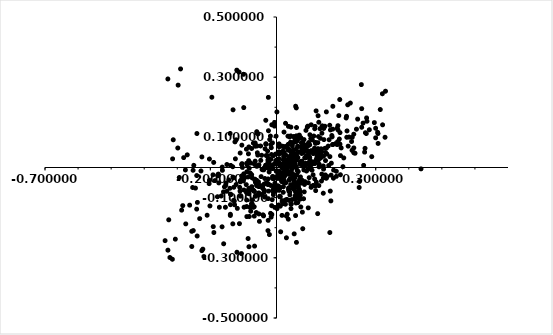
| Category | Log10 (GFP) |
|---|---|
| -0.1323 | 0.002 |
| 0.0478 | 0.018 |
| 0.1305 | 0.048 |
| 0.1004 | 0.034 |
| 0.3296 | 0.253 |
| 0.0146 | -0.022 |
| -0.0314 | 0.007 |
| 0.0942 | 0.07 |
| 0.2576 | 0.196 |
| -0.07 | 0.081 |
| 0.1342 | 0.047 |
| 0.1695 | 0.076 |
| 0.1578 | 0.006 |
| 0.1704 | 0.203 |
| 0.165 | -0.025 |
| 0.1859 | 0.125 |
| 0.1074 | -0.009 |
| 0.1563 | 0.071 |
| 0.1116 | -0.059 |
| 0.1091 | 0.015 |
| 0.1701 | 0.128 |
| 0.1482 | 0.023 |
| 0.2736 | 0.154 |
| 0.133 | 0.032 |
| 0.1658 | 0.014 |
| 0.229 | 0.1 |
| 0.1834 | 0.131 |
| 0.2677 | 0.064 |
| 0.0689 | -0.072 |
| 0.1084 | 0.092 |
| 0.0375 | -0.079 |
| -0.0334 | 0.002 |
| 0.0966 | -0.005 |
| 0.1848 | 0.086 |
| 0.1107 | -0.024 |
| 0.1309 | 0.044 |
| 0.1478 | -0.025 |
| -0.2974 | 0.274 |
| 0.2125 | 0.1 |
| -0.0111 | -0.004 |
| 0.192 | 0.116 |
| 0.1857 | 0.139 |
| 0.1681 | 0.102 |
| -0.0644 | 0.021 |
| 0.03 | -0.234 |
| -0.2561 | -0.262 |
| -0.0833 | -0.263 |
| 0.0458 | 0.01 |
| 0.0604 | -0.249 |
| -0.2257 | -0.276 |
| 0.0038 | -0.025 |
| 0.0282 | -0.051 |
| -0.0516 | -0.063 |
| -0.0883 | -0.078 |
| -0.1038 | -0.043 |
| -0.2744 | -0.187 |
| -0.0412 | -0.07 |
| -0.0814 | -0.074 |
| -0.0264 | 0.002 |
| -0.0537 | -0.059 |
| 0.0512 | 0.005 |
| -0.0906 | -0.084 |
| 0.0735 | -0.131 |
| -0.0984 | -0.075 |
| -0.0905 | 0.014 |
| 0.0832 | 0.054 |
| -0.0255 | 0.001 |
| 0.053 | 0.045 |
| -0.0598 | -0.043 |
| -0.0449 | 0.041 |
| -0.0733 | -0.035 |
| -0.0311 | 0.04 |
| 0.0026 | -0.036 |
| 0.0379 | 0.059 |
| -0.0597 | 0.119 |
| -0.2939 | -0.033 |
| 0.1315 | 0.129 |
| -0.0611 | -0.15 |
| -0.1031 | 0 |
| 0.0493 | 0.045 |
| -0.0036 | 0.014 |
| 0.0911 | 0.01 |
| 0.1463 | 0.137 |
| 0.0557 | 0.09 |
| -0.1314 | 0.192 |
| -0.1092 | -0.048 |
| 0.1257 | 0.172 |
| -0.2027 | -0.043 |
| 0.1157 | 0.059 |
| 0.1192 | 0.022 |
| 0.0435 | 0.052 |
| 0.0537 | 0.1 |
| -0.0243 | 0.02 |
| 0.0428 | -0.057 |
| 0.0597 | 0.026 |
| 0.1434 | 0.093 |
| 0.1198 | 0.188 |
| 0.2117 | 0.17 |
| 0.2107 | 0.164 |
| 0.2154 | 0.208 |
| 0.1128 | 0.105 |
| -0.0988 | -0.021 |
| 0.1287 | 0.002 |
| -0.2901 | 0.328 |
| 0.1462 | 0.064 |
| 0.1508 | 0.185 |
| 0.1373 | 0.114 |
| 0.2807 | 0.125 |
| 0.0013 | 0.185 |
| -0.3122 | 0.092 |
| -0.0059 | 0.15 |
| 0.0578 | 0.204 |
| -0.0099 | 0.01 |
| -0.0555 | 0.112 |
| 0.0691 | 0.108 |
| 0.0179 | -0.111 |
| -0.0013 | 0.104 |
| 0.0228 | -0.051 |
| 0.0374 | 0.005 |
| 0.0204 | -0.082 |
| -0.2562 | -0.212 |
| -0.3059 | -0.238 |
| -0.3369 | -0.243 |
| -0.3224 | -0.299 |
| -0.3283 | -0.275 |
| -0.3149 | -0.305 |
| -0.1396 | -0.159 |
| -0.3258 | -0.174 |
| -0.2398 | -0.228 |
| -0.2868 | -0.142 |
| -0.1646 | -0.197 |
| -0.0779 | -0.145 |
| -0.28346063 | -0.127 |
| 0.0904878 | 0.033 |
| 0.0790152 | 0.082 |
| 0.11638837 | 0.137 |
| 0.03994141 | 0.101 |
| 0.03629185 | 0.058 |
| 0.06121723 | 0.037 |
| 0.04356055 | 0.134 |
| 0.12093599 | 0.053 |
| 0.05774285 | 0.086 |
| 0.18852857 | 0.172 |
| 0.1016651 | 0.024 |
| 0.13283522 | 0.097 |
| 0.12841113 | 0.057 |
| 0.12692636 | 0.103 |
| 0.22324104 | 0.214 |
| 0.19556961 | 0.065 |
| 0.11562578 | 0.129 |
| 0.06466403 | 0.07 |
| 0.08314743 | 0.093 |
| 0.05336043 | 0.084 |
| -0.00302119 | -0.078 |
| 0.017698659 | -0.026 |
| 0.045682216 | -0.007 |
| -0.02239525 | 0.014 |
| 0.005237034 | -0.027 |
| -0.13792652 | -0.09 |
| -0.04184453 | -0.064 |
| 0.05173754 | 0.04 |
| 0.10095557 | 0.109 |
| 0.00746229 | 0.029 |
| -0.21959657 | -0.296 |
| -0.05788444 | 0.049 |
| 0.07578092 | 0.065 |
| 0.06812796 | 0.052 |
| 0.084542205 | -0.056 |
| 0.09434334 | 0.04 |
| -0.05372995 | -0.085 |
| 0.05616785 | 0.032 |
| 0.07530935 | 0.082 |
| 0.07602898 | 0.017 |
| 0.0852772 | 0.032 |
| 0.12813915 | -0.06 |
| 0.07169322 | 0.01 |
| -0.23225151 | -0.17 |
| 0.0101594 | -0.098 |
| 0.057670604 | -0.16 |
| 0.05 | -0.03 |
| 0.104551755 | -0.066 |
| 0.083867156 | -0.081 |
| -0.25168962 | -0.21 |
| 0.001709823 | -0.137 |
| 0.150746 | -0.036 |
| 0.180987528 | -0.029 |
| 0.142312833 | -0.005 |
| 0.0540969 | 0.045 |
| 0.03407979 | 0.002 |
| 0.096318734 | -0.051 |
| -0.32846824 | 0.294 |
| -0.12004247 | 0.324 |
| 0.081881023 | -0.104 |
| 0.172134107 | -0.036 |
| 0.30689893 | 0.113 |
| 0.2664525 | 0.051 |
| 0.19346536 | 0.039 |
| 0.16309644 | 0.125 |
| 0.10452427 | 0.013 |
| 0.328227 | 0.1 |
| 0.250983957 | -0.046 |
| -0.0172264 | 0.027 |
| -0.02354812 | -0.055 |
| 0.04900255 | -0.024 |
| -0.00424297 | 0.012 |
| -0.09017663 | -0.13 |
| 0.02003885 | 0.055 |
| 0.0336471 | -0.013 |
| -0.05319306 | -0.154 |
| 0.048463384 | -0.02 |
| -0.10528405 | 0.01 |
| -0.0261028 | -0.056 |
| -0.02546272 | -0.038 |
| 0.08715018 | 0.032 |
| 0.065911522 | -0.047 |
| 0.05435766 | 0.045 |
| 0.01189922 | 0.071 |
| -0.08354605 | 0.068 |
| 0.007771478 | -0.076 |
| 0.072086429 | -0.092 |
| 0.044125825 | -0.122 |
| 0.01762596 | 0.071 |
| -0.03198705 | 0.077 |
| 0.04006683 | 0.01 |
| 0.02496633 | 0.024 |
| 0.09776577 | 0.048 |
| -0.20121728 | -0.128 |
| 0.11781369 | 0.083 |
| -0.24111497 | -0.027 |
| 0.03456439 | 0.104 |
| -0.08591463 | -0.236 |
| -0.12180919 | 0.092 |
| -0.06452652 | 0.082 |
| 0.03456439 | -0.02 |
| -0.0465068 | -0.03 |
| -0.13214455 | -0.187 |
| -0.08497768 | -0.086 |
| -0.00679081 | -0.069 |
| 0.010888176 | -0.037 |
| 0.0209267 | -0.064 |
| 0.02672511 | -0.108 |
| -0.03907123 | -0.161 |
| 0.078261455 | -0.148 |
| 0.070519815 | -0.104 |
| -0.02392372 | -0.079 |
| -0.04378821 | -0.006 |
| 0.019171973 | -0.022 |
| 0.0562273 | -0.094 |
| -0.05268659 | -0.091 |
| 0.036408143 | -0.068 |
| 0.01975767 | -0.12 |
| -0.009913 | -0.036 |
| 0.040333362 | -0.091 |
| 0.007825338 | -0.013 |
| 0.04551446 | 0.01 |
| -0.14418868 | -0.041 |
| -0.03872829 | -0.008 |
| -0.02823124 | -0.054 |
| 0.06424849 | 0.07 |
| 0.05471481 | 0.011 |
| -0.01861547 | -0.004 |
| 0.001818402 | -0.011 |
| 0.052567493 | -0.046 |
| 0.049868326 | -0.058 |
| 0.065817284 | -0.014 |
| -0.00488663 | -0.052 |
| 0.03611498 | 0.137 |
| 0.064248489 | -0.117 |
| 0.07918125 | 0.005 |
| 0.09654542 | 0.051 |
| -0.04812607 | 0.072 |
| 0.082710066 | -0.008 |
| -0.13874325 | 0.007 |
| -0.09091276 | 0.061 |
| 0.05120843 | 0.025 |
| -0.26986737 | 0.042 |
| -0.1770989 | -0.027 |
| -0.15 | 0.01 |
| -0.20281353 | 0.028 |
| -0.14996959 | -0.079 |
| -0.20361704 | -0.054 |
| -0.02432064 | 0.122 |
| 0.0254103 | 0.069 |
| 0.097413 | 0.083 |
| -0.0323783 | 0.157 |
| 0.06050088 | 0.133 |
| 0.02730472 | 0.147 |
| 0.08641758 | 0.064 |
| -0.0143243 | 0.142 |
| 0.12544168 | 0.063 |
| 0.04806624 | 0.072 |
| 0.03804011 | 0.016 |
| 0.03 | -0.02 |
| 0.07 | -0.04 |
| 0.142 | 0.037 |
| 0.136 | -0.045 |
| 0.086 | -0.047 |
| 0.053 | -0.073 |
| 0.043 | 0.105 |
| 0.102 | 0.006 |
| 0.056 | -0.034 |
| 0.288 | 0.036 |
| -0.099 | 0.199 |
| 0.098 | 0.038 |
| -0.07 | -0.077 |
| -0.113 | 0.317 |
| -0.0822337 | -0.163 |
| -0.00169316 | -0.068 |
| -0.15970084 | -0.253 |
| 0.020007405 | -0.024 |
| 0.04236455 | 0.04 |
| 0.07767654 | 0.056 |
| 0.0804936 | 0.008 |
| 0.05839588 | 0.004 |
| 0.12789222 | 0.15 |
| -0.04779784 | -0.061 |
| 0.13820472 | 0.138 |
| 0.17066928 | 0.077 |
| 0.098820979 | -0.034 |
| -0.00542197 | -0.06 |
| 0.1863856 | 0.078 |
| 0.05988889 | 0.025 |
| -0.19200528 | -0.024 |
| 0.19126929 | 0.226 |
| -0.10976071 | 0.048 |
| 0.04790747 | 0.053 |
| 0.06027594 | 0.105 |
| 0.04597297 | 0.026 |
| 0.11606234 | 0.014 |
| -0.02144041 | -0.223 |
| 0.08760637 | 0.065 |
| 0.27160438 | 0.113 |
| 0.07370776 | 0.099 |
| 0.21679876 | 0.071 |
| 0.03302067 | -0.002 |
| 0.06153383 | 0.087 |
| 0.29977299 | 0.13 |
| -0.17860892 | -0.097 |
| 0.09640765 | 0.054 |
| 0.03456896 | 0.059 |
| -0.01793802 | -0.152 |
| 0.250034343 | -0.066 |
| 0.21322849 | 0.122 |
| 0.01561492 | -0.045 |
| 0.1673572 | 0.106 |
| 0.31381035 | 0.193 |
| 0.141561533 | -0.035 |
| 0.2337344 | 0.049 |
| 0.26890968 | 0.115 |
| 0.106346171 | -0.062 |
| 0.20338717 | 0.032 |
| 0.02990743 | 0.01 |
| 0.060806973 | -0.056 |
| 0.068021333 | -0.074 |
| 0.115421311 | -0.038 |
| -0.0269277 | 0.054 |
| -0.01505351 | 0.043 |
| 0.0390921 | 0.059 |
| 0.03509672 | 0.019 |
| -0.01505351 | 0.003 |
| 0.02944071 | 0.026 |
| 0.08077393 | 0.05 |
| 0.05853556 | 0.06 |
| 0.043838532 | -0.137 |
| -0.15279343 | -0.052 |
| 0.00776317 | 0.044 |
| -0.06665678 | -0.08 |
| 0.02371007 | 0.009 |
| -0.12755761 | -0.112 |
| -0.16028145 | -0.081 |
| -0.05861406 | 0.072 |
| -0.05966196 | 0.004 |
| -0.01584228 | 0.066 |
| -0.0329832 | 0.007 |
| -0.05302011 | 0.009 |
| -0.01182721 | -0.036 |
| -0.02261769 | -0.001 |
| -0.00260057 | 0.045 |
| -0.06640696 | 0.01 |
| -0.07019995 | -0.132 |
| 0.05985154 | 0.198 |
| -0.02604544 | 0.016 |
| 0.03246239 | 0.072 |
| 0.02334461 | 0.049 |
| 0.00258509 | 0.021 |
| 0.03843628 | 0.035 |
| 0.10487423 | 0.142 |
| 0.01088193 | 0.048 |
| 0.0227299 | 0.118 |
| 0.0945702 | 0.137 |
| -0.0794406 | -0.019 |
| -0.08968992 | -0.163 |
| 0.00711974 | -0.124 |
| 0.059059272 | -0.118 |
| 0.124524136 | -0.153 |
| -0.18930994 | -0.216 |
| 0.162614185 | -0.078 |
| 0.164427526 | -0.111 |
| 0.016705694 | -0.159 |
| 0.20079952 | 0.003 |
| -0.01618676 | -0.165 |
| -0.08277791 | -0.087 |
| 0.12649145 | 0.025 |
| -0.13956283 | -0.155 |
| 0.43696411657374434 | -0.005 |
| -0.12204481 | -0.057 |
| -0.04082628 | -0.157 |
| -0.0113465 | -0.035 |
| -0.03569427 | -0.098 |
| -0.26258836 | -0.125 |
| 0.030085371 | -0.162 |
| 0.037186211 | -0.109 |
| 0.161299615 | -0.216 |
| -0.09034624 | -0.108 |
| 0.065649859 | -0.101 |
| -0.0672063 | -0.162 |
| -0.08354605 | -0.07 |
| -0.01397094 | -0.156 |
| 0.01378828 | 0.051 |
| -0.08482151 | 0.045 |
| -0.02048939 | 0.093 |
| -0.12427213 | 0.029 |
| -0.0080801 | -0.037 |
| -0.05656475 | 0.041 |
| -0.17659189 | -0.024 |
| -0.02470587 | 0.233 |
| 0.13629672 | 0.053 |
| -0.03760666 | -0.055 |
| -0.12963386 | -0.109 |
| -0.10857303 | -0.043 |
| -0.0091008 | -0.083 |
| -0.2500999 | 0.007 |
| -0.0588505 | 0.114 |
| -0.02576642 | -0.21 |
| -0.02470587 | 0.03 |
| -0.03218468 | 0.079 |
| 0.036452269 | -0.074 |
| -0.05429096 | 0.006 |
| -0.08848647 | 0.008 |
| -0.10601081 | -0.286 |
| 0.04825201 | 0.081 |
| -0.12560637 | 0.085 |
| 0.03553118 | 0.077 |
| -0.10473535 | 0.074 |
| -0.07519687 | 0.063 |
| -0.01217728 | 0.082 |
| -0.006046 | 0.137 |
| 0.02147511 | 0.036 |
| 0.05270635 | 0.103 |
| -0.11115045 | -0.066 |
| -0.01735367 | 0.076 |
| 0.056537997 | -0.056 |
| 0.071566987 | -0.105 |
| 0.056538 | 0.014 |
| 0.018193005 | -0.001 |
| 0.039912255 | -0.082 |
| -0.10897861 | -0.095 |
| -0.28061553 | 0.033 |
| 0.038851706 | -0.023 |
| -0.01177022 | -0.03 |
| -0.01296498 | -0.107 |
| -0.08011121 | -0.132 |
| -0.03757748 | -0.081 |
| 0.02701147 | -0.122 |
| 0.047264453 | -0.106 |
| 0.054494254 | -0.069 |
| 0.017078 | -0.048 |
| 0.141458158 | -0.085 |
| -0.10011515 | -0.04 |
| 0.062612145 | -0.01 |
| 0.057556273 | -0.055 |
| -0.11197376 | -0.187 |
| -0.00939052 | -0.09 |
| 0.012589127 | -0.214 |
| 0.032433444 | -0.155 |
| 0.011459622 | -0.129 |
| 0.035654431 | -0.172 |
| -0.06636657 | -0.261 |
| -0.06366908 | -0.049 |
| 0.061605668 | -0.089 |
| 0.02031139 | 0.026 |
| 0.01575183 | 0.011 |
| 0.00765556 | 0.079 |
| 0.172711518 | -0.009 |
| 0.02706222 | -0.025 |
| 0.18916107 | 0.08 |
| 0.136950345 | -0.022 |
| 0.19184309 | 0.078 |
| 0.18296781 | 0.076 |
| 0.25764247 | 0.134 |
| 0.32020598 | 0.245 |
| 0.052009835 | -0.062 |
| 0.06601218 | 0.095 |
| 0.10034225 | 0.075 |
| 0.02984439 | 0.005 |
| 0.01803759 | 0.048 |
| -0.24066809 | 0.113 |
| 0.17826422 | 0.079 |
| 0.29984015 | 0.099 |
| 0.30722377 | 0.08 |
| 0.07467525 | 0.015 |
| 0.05421804 | 0.004 |
| 0.0760054 | 0.046 |
| 0.013244087 | -0.017 |
| -0.00637508 | -0.032 |
| 0.10490483 | 0.055 |
| 0.04002415 | 0.034 |
| 0.08715018 | 0.014 |
| 0.02906576 | 0.069 |
| -0.05293608 | -0.086 |
| 0.02160347 | 0.069 |
| 0.057695196 | -0.099 |
| 0.09229743 | 0.076 |
| 0.038578906 | -0.042 |
| -0.04760724 | 0.024 |
| 0.11351719 | 0.057 |
| 0.016302511 | -0.001 |
| -0.06932649 | -0.076 |
| 0.072672352 | -0.052 |
| 0.00706185 | 0.052 |
| 0.04146459 | 0.029 |
| 0.08908755 | 0.123 |
| 0.13490947 | 0.062 |
| 0.12255903 | 0.049 |
| 0.10366043 | 0.096 |
| 0.07931307 | 0.083 |
| 0.15084867 | 0.064 |
| 0.15915284 | 0.092 |
| 0.22844337 | 0.057 |
| 0.11399226 | 0.014 |
| 0.048672655 | -0.069 |
| 0.14147043 | 0.005 |
| 0.14830268 | 0.05 |
| 0.009434719 | -0.064 |
| 0.10559745 | 0.055 |
| 0.19006496 | 0.095 |
| 0.193336501 | -0.024 |
| 0.180939052 | -0.013 |
| 0.08308481 | 0.071 |
| 0.044101092 | -0.121 |
| 0.118371739 | -0.077 |
| 0.09601889 | -0.134 |
| 0.07245283 | -0.031 |
| -0.02217601 | -0.015 |
| 0.13265903 | 0.04 |
| -0.00063633 | -0.013 |
| 0.00693877 | 0.018 |
| -0.00511693 | -0.133 |
| 0.056558893 | -0.104 |
| 0.153245561 | -0.03 |
| 0.117887306 | -0.062 |
| 0.2374613 | 0.047 |
| 0.26353037 | 0.007 |
| 0.059341058 | -0.085 |
| 0.079393149 | -0.203 |
| 0.30577297 | 0.117 |
| 0.26179388 | 0.148 |
| 0.25654237 | 0.275 |
| 0.1149693 | 0.064 |
| 0.23376516 | 0.065 |
| 0.07183342 | 0.019 |
| 0.1073891 | 0.011 |
| 0.02775989 | 0.042 |
| 0.04683115 | 0.02 |
| 0.04811604 | -0.036 |
| 0.16102189 | 0.14 |
| 0.1178945 | 0.08 |
| 0.04811604 | 0.017 |
| 0.12493874 | 0.083 |
| 0.08968365 | 0.039 |
| 0.02098449 | 0.001 |
| -0.25227293 | -0.009 |
| 0.05067449 | 0.058 |
| 0.09604917 | 0.016 |
| 0.09200919 | 0.011 |
| 0.11128914 | 0.046 |
| 0.05321795 | 0.001 |
| 0.08322344 | 0.006 |
| 0.15253053 | 0.045 |
| 0.06571649 | 0.051 |
| -0.01680407 | -0.06 |
| 0.16151625 | 0.036 |
| 0.007108088 | -0.025 |
| -0.10486567 | -0.028 |
| 0.14283947 | 0.13 |
| 0.07666567 | 0.02 |
| 0.07786538 | 0.073 |
| 0.102888596 | -0.001 |
| 0.12115989 | 0.03 |
| 0.066332077 | -0.064 |
| -0.067395487 | -0.13 |
| -0.06488873 | -0.039 |
| -0.110299202 | -0.078 |
| -0.036469629 | -0.076 |
| -0.07500376 | -0.024 |
| -0.053784005 | -0.063 |
| -0.253661021 | -0.066 |
| -0.037055327 | -0.001 |
| -0.064264295 | 0.071 |
| -0.026059942 | 0.024 |
| -0.009246443 | 0.039 |
| 0.047851256 | 0.041 |
| 0.027119629 | 0.018 |
| -0.084051889 | 0.023 |
| 0.011156802 | -0.068 |
| 0.132540584 | 0.032 |
| 0.22698459 | 0.086 |
| 0.219582579 | 0.101 |
| 0.27239093 | 0.165 |
| 0.24541481 | 0.161 |
| 0.320756115 | 0.142 |
| 0.295887153 | 0.149 |
| 0.24172912 | 0.127 |
| 0.233634508 | 0.111 |
| 0.116378925 | 0.015 |
| 0.02356606 | -0.031 |
| 0.093126465 | 0.134 |
| 0.024075496 | 0.027 |
| -0.08251942 | -0.003 |
| -0.02745271 | 0.039 |
| 0.022675257 | -0.005 |
| -0.01833885 | 0.104 |
| 0.04241932 | 0.084 |
| 0.06475602 | 0.033 |
| -0.06056485 | -0.055 |
| 0.04542483 | 0.042 |
| 0.04422512 | 0.035 |
| 0.02330604 | -0.016 |
| 0.031423931 | -0.106 |
| -0.09807546 | -0.132 |
| 0.00790846 | 0.009 |
| 0.02267526 | 0.043 |
| -0.13913484 | -0.123 |
| 0.06014808 | 0.045 |
| -0.03531669 | -0.037 |
| -0.0544907 | -0.048 |
| -0.05148519 | -0.179 |
| 0.01695659 | -0.112 |
| 0.011161621 | -0.097 |
| -0.0310096 | -0.051 |
| -0.01077375 | -0.074 |
| 0.060726756 | -0.101 |
| -0.0729741 | -0.122 |
| -0.02745271 | -0.053 |
| 0.009863281 | -0.095 |
| -0.00602731 | -0.072 |
| -0.08595935 | -0.032 |
| 0.060666732 | -0.024 |
| -0.05973302 | -0.061 |
| -0.07561851 | -0.121 |
| -0.13182018 | -0.032 |
| -0.16413555 | 0.001 |
| -0.08975884 | -0.014 |
| -0.12899825 | -0.066 |
| -0.07460749 | -0.064 |
| -0.23918873 | -0.116 |
| -0.01455059 | -0.127 |
| 0.060044087 | 0.001 |
| 0.090712907 | -0.012 |
| 0.038324837 | -0.017 |
| -0.06302939 | -0.095 |
| -0.02503407 | -0.176 |
| 0.057544544 | -0.08 |
| -0.04203709 | -0.007 |
| 0.048681083 | -0.033 |
| 0.120443825 | -0.049 |
| 0.015461954 | -0.042 |
| 0.07774793 | -0.043 |
| 0.004271783 | -0.061 |
| 0.11168097 | 0.019 |
| -0.02503407 | -0.103 |
| 0.028386315 | -0.007 |
| 0.04093714 | -0.037 |
| 0.022991283 | -0.042 |
| 0.075949606 | 0.021 |
| -0.07391873 | -0.108 |
| 0.122607189 | 0.039 |
| 0.007799784 | 0.069 |
| -0.11948777 | -0.282 |
| 0.103302034 | -0.005 |
| -0.19547773 | 0.233 |
| -0.1001616 | -0.045 |
| -0.18602688 | -0.044 |
| -0.11843906 | -0.136 |
| -0.20975752 | -0.159 |
| -0.15448417 | -0.132 |
| -0.22282516 | -0.271 |
| -0.1392442 | -0.089 |
| -0.19118943 | -0.196 |
| -0.13012482 | -0.034 |
| -0.22844718 | -0.012 |
| -0.22562707 | 0.035 |
| -0.31418501 | 0.029 |
| -0.17276012 | -0.132 |
| -0.16352602 | -0.009 |
| -0.06576409 | -0.041 |
| -0.15747725 | -0.064 |
| -0.17588231 | -0.022 |
| -0.24502807 | -0.068 |
| -0.16719613 | -0.095 |
| -0.14097561 | -0.069 |
| -0.12675383 | -0.124 |
| -0.15329269 | -0.059 |
| -0.24136929 | -0.138 |
| -0.10439349 | 0.013 |
| -0.07799303 | 0.015 |
| 0.053506938 | -0.22 |
| -0.29848778 | 0.065 |
| -0.09142056 | -0.057 |
| 0.03508886 | 0.061 |
| 0.12916754 | 0.011 |
| 0.071175591 | -0.081 |
| -0.27545161 | -0.008 |
| -0.17439479 | -0.051 |
| -0.14021918 | 0.113 |
| -0.09563704 | -0.033 |
| -0.09989487 | 0.31 |
| -0.189907 | 0.017 |
| -0.02717966 | -0.001 |
| -0.0344789 | 0.062 |
| -0.04283991 | -0.089 |
| -0.00255719 | 0.023 |